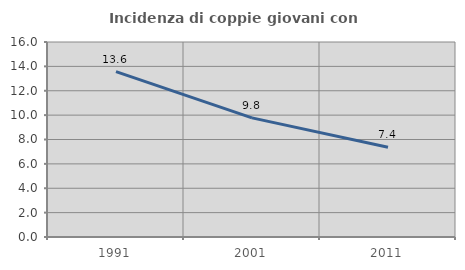
| Category | Incidenza di coppie giovani con figli |
|---|---|
| 1991.0 | 13.567 |
| 2001.0 | 9.774 |
| 2011.0 | 7.358 |